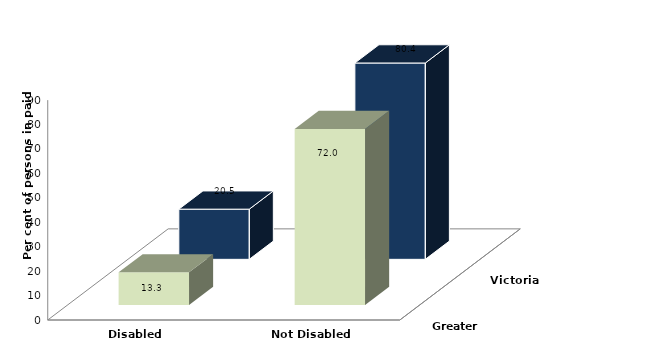
| Category | Greater Dandenong | Victoria |
|---|---|---|
| Disabled | 13.316 | 20.535 |
| Not Disabled | 72.008 | 80.364 |